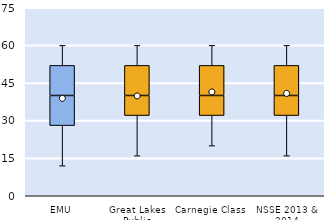
| Category | 25th | 50th | 75th |
|---|---|---|---|
| EMU | 28 | 12 | 12 |
| Great Lakes Public | 32 | 8 | 12 |
| Carnegie Class | 32 | 8 | 12 |
| NSSE 2013 & 2014 | 32 | 8 | 12 |